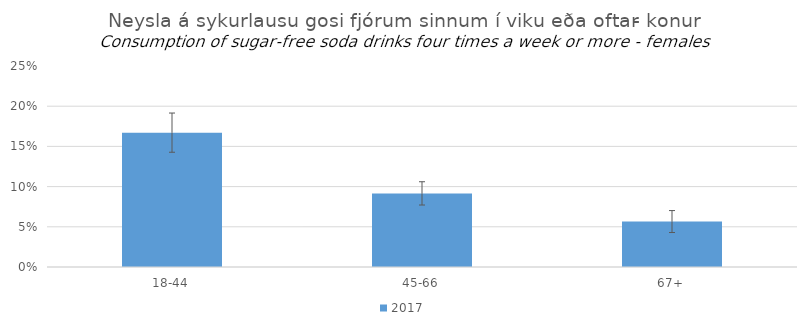
| Category | 2017 |
|---|---|
| 18-44 | 0.167 |
| 45-66 | 0.092 |
| 67+ | 0.057 |